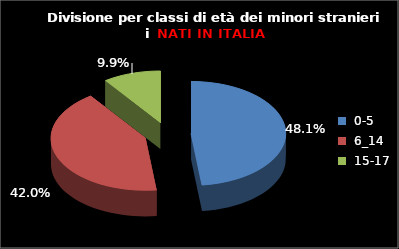
| Category | Series 0 |
|---|---|
| 0-5 | 78 |
| 6_14 | 68 |
| 15-17 | 16 |